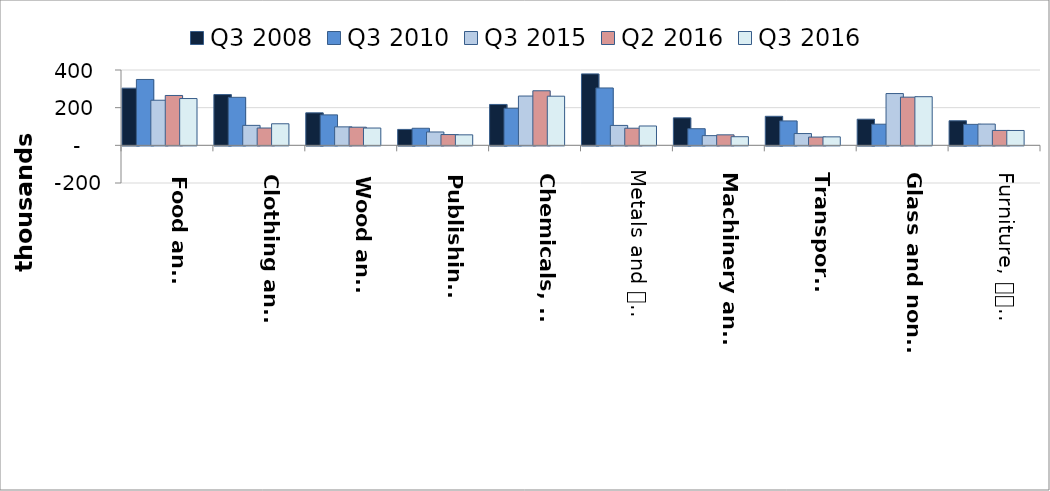
| Category | Q3 2008 | Q3 2010 | Q3 2015 | Q2 2016 | Q3 2016 | Series 6 |
|---|---|---|---|---|---|---|
| Food and 
beverages | 303.532 | 349.728 | 239.507 | 264.765 | 248.437 | -16.327 |
| Clothing and 
footwear | 269.54 | 254.942 | 105.986 | 91.904 | 114.477 | 22.572 |
| Wood and 
paper | 172.614 | 161.699 | 98.066 | 96.328 | 91.817 | -4.511 |
| Publishing 
and printing | 84.543 | 90.598 | 70.918 | 57.267 | 55.757 | -1.509 |
| Chemicals, 
rubber, plastic | 217.097 | 196.664 | 261.735 | 289.734 | 260.891 | -28.843 |
| Metals and 
metal products | 379.424 | 304.612 | 105.756 | 90.942 | 102.723 | 11.78 |
| Machinery and 
equipment | 146.039 | 88.247 | 51.516 | 55.741 | 45.746 | -9.995 |
| Transport 
equipment | 154.248 | 129.539 | 62.513 | 43.75 | 45.03 | 1.28 |
| Glass and non-
metallic minerals | 138.683 | 112.265 | 274.972 | 255.886 | 258.237 | 2.351 |
| Furniture, 
recycling, other | 130.505 | 111.373 | 112.864 | 79.16 | 78.913 | -0.247 |